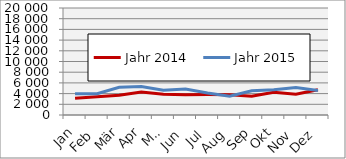
| Category | Jahr 2014 | Jahr 2015 |
|---|---|---|
| Jan | 3118.78 | 3950.899 |
| Feb | 3401.476 | 3975.113 |
| Mär | 3681.86 | 5196.902 |
| Apr | 4305.495 | 5315.863 |
| Mai | 3857.643 | 4632.283 |
| Jun | 3772.734 | 4875.055 |
| Jul | 3811.881 | 4095.566 |
| Aug | 3805.678 | 3530.516 |
| Sep | 3508.051 | 4513.993 |
| Okt | 4260.707 | 4708.369 |
| Nov | 3875.256 | 5137.5 |
| Dez | 4707.8 | 4576.72 |